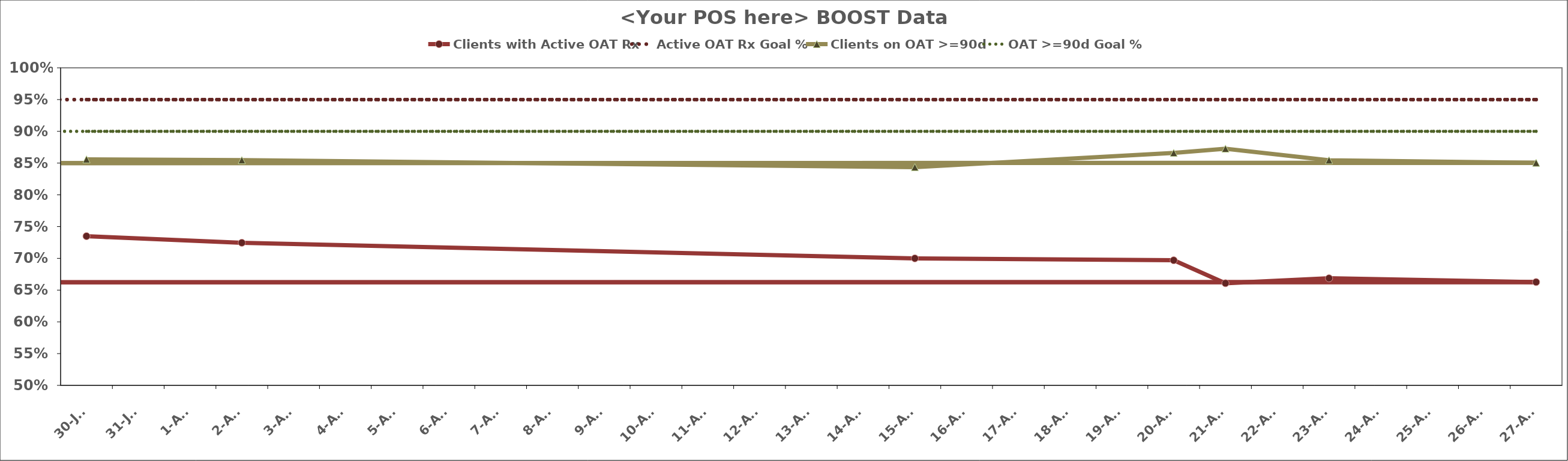
| Category | Clients with Active OAT Rx | Active OAT Rx Goal % | Clients on OAT >=90d | OAT >=90d Goal % |
|---|---|---|---|---|
| 2018-07-30 | 0.735 | 0.95 | 0.856 | 0.9 |
| 2018-08-02 | 0.725 | 0.95 | 0.855 | 0.9 |
| 2018-08-15 | 0.7 | 0.95 | 0.843 | 0.9 |
| 2018-08-20 | 0.697 | 0.95 | 0.866 | 0.9 |
| 2018-08-21 | 0.661 | 0.95 | 0.873 | 0.9 |
| 2018-08-23 | 0.669 | 0.95 | 0.855 | 0.9 |
| 2018-08-27 | 0.663 | 0.95 | 0.85 | 0.9 |
| nan | 0 | 0.95 | 0 | 0.9 |
| nan | 0 | 0.95 | 0 | 0.9 |
| nan | 0 | 0.95 | 0 | 0.9 |
| nan | 0 | 0.95 | 0 | 0.9 |
| nan | 0 | 0.95 | 0 | 0.9 |
| nan | 0 | 0.95 | 0 | 0.9 |
| nan | 0 | 0.95 | 0 | 0.9 |
| nan | 0 | 0.95 | 0 | 0.9 |
| nan | 0 | 0.95 | 0 | 0.9 |
| nan | 0 | 0.95 | 0 | 0.9 |
| nan | 0 | 0.95 | 0 | 0.9 |
| nan | 0 | 0.95 | 0 | 0.9 |
| nan | 0 | 0.95 | 0 | 0.9 |
| nan | 0 | 0.95 | 0 | 0.9 |
| nan | 0 | 0.95 | 0 | 0.9 |
| nan | 0 | 0.95 | 0 | 0.9 |
| nan | 0 | 0.95 | 0 | 0.9 |
| nan | 0 | 0.95 | 0 | 0.9 |
| nan | 0 | 0.95 | 0 | 0.9 |
| nan | 0 | 0.95 | 0 | 0.9 |
| nan | 0 | 0.95 | 0 | 0.9 |
| nan | 0 | 0.95 | 0 | 0.9 |
| nan | 0 | 0.95 | 0 | 0.9 |
| nan | 0 | 0.95 | 0 | 0.9 |
| nan | 0 | 0.95 | 0 | 0.9 |
| nan | 0 | 0.95 | 0 | 0.9 |